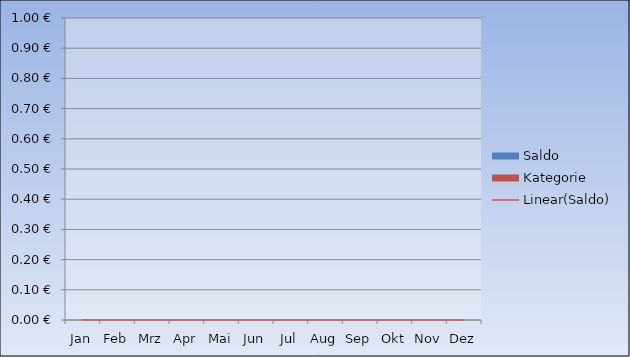
| Category | Saldo | Kategorie |
|---|---|---|
| Jan | 0 | 0 |
| Feb | 0 | 0 |
| Mrz | 0 | 0 |
| Apr | 0 | 0 |
| Mai | 0 | 0 |
| Jun | 0 | 0 |
| Jul | 0 | 0 |
| Aug | 0 | 0 |
| Sep | 0 | 0 |
| Okt | 0 | 0 |
| Nov | 0 | 0 |
| Dez | 0 | 0 |